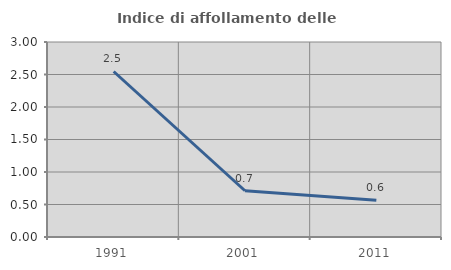
| Category | Indice di affollamento delle abitazioni  |
|---|---|
| 1991.0 | 2.546 |
| 2001.0 | 0.712 |
| 2011.0 | 0.564 |